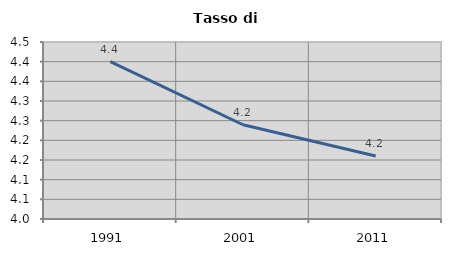
| Category | Tasso di disoccupazione   |
|---|---|
| 1991.0 | 4.4 |
| 2001.0 | 4.24 |
| 2011.0 | 4.16 |